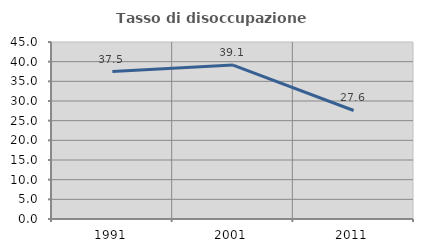
| Category | Tasso di disoccupazione giovanile  |
|---|---|
| 1991.0 | 37.5 |
| 2001.0 | 39.13 |
| 2011.0 | 27.586 |